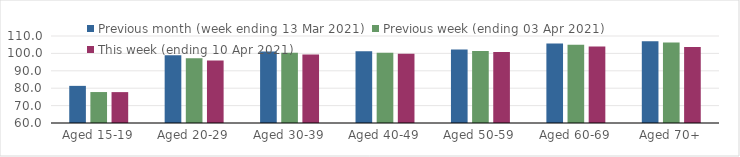
| Category | Previous month (week ending 13 Mar 2021) | Previous week (ending 03 Apr 2021) | This week (ending 10 Apr 2021) |
|---|---|---|---|
| Aged 15-19 | 81.34 | 77.79 | 77.75 |
| Aged 20-29 | 98.87 | 97.23 | 95.94 |
| Aged 30-39 | 101.15 | 100.31 | 99.33 |
| Aged 40-49 | 101.25 | 100.43 | 99.75 |
| Aged 50-59 | 102.27 | 101.44 | 100.84 |
| Aged 60-69 | 105.67 | 104.99 | 103.91 |
| Aged 70+ | 107 | 106.32 | 103.61 |